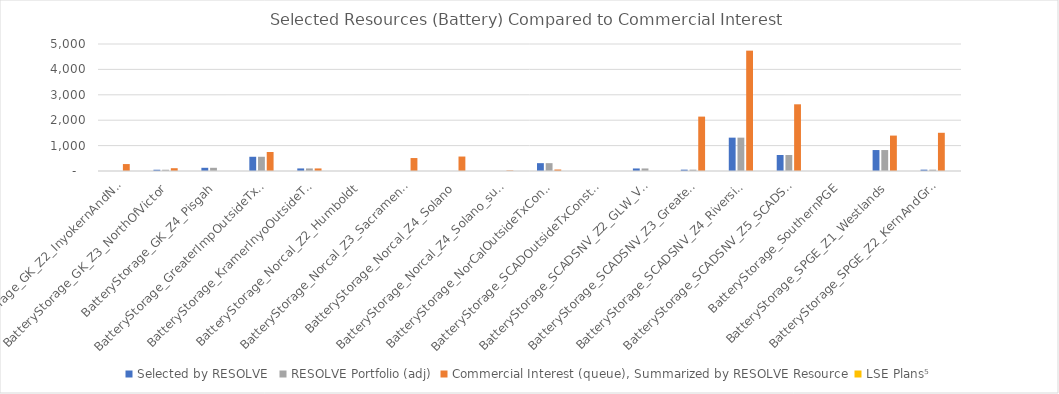
| Category | Selected by RESOLVE  | RESOLVE Portfolio (adj) |  Commercial Interest (queue), Summarized by RESOLVE Resource  | LSE Plans⁵ |
|---|---|---|---|---|
| BatteryStorage_GK_Z2_InyokernAndNorthOfKramer | 0 | 0 | 273.26 | 0 |
| BatteryStorage_GK_Z3_NorthOfVictor | 50 | 50 | 110.04 | 0 |
| BatteryStorage_GK_Z4_Pisgah | 126 | 126 | 0 | 0 |
| BatteryStorage_GreaterImpOutsideTxConstraintZones | 560 | 560 | 747.7 | 0 |
| BatteryStorage_KramerInyoOutsideTxConstraintZones | 101 | 101 | 100.98 | 0 |
| BatteryStorage_Norcal_Z2_Humboldt | 0 | 0 | 0 | 0 |
| BatteryStorage_Norcal_Z3_SacramentoRiver | 0 | 0 | 510 | 0 |
| BatteryStorage_Norcal_Z4_Solano | 0 | 0 | 569.5 | 0 |
| BatteryStorage_Norcal_Z4_Solano_subzone | 0 | 0 | 20 | 0 |
| BatteryStorage_NorCalOutsideTxConstraintZones | 309 | 309 | 58.75 | 0 |
| BatteryStorage_SCADOutsideTxConstraintZones | 0 | 0 | 0 | 0 |
| BatteryStorage_SCADSNV_Z2_GLW_VEA | 100 | 100 | 0 | 0 |
| BatteryStorage_SCADSNV_Z3_GreaterImperial | 53 | 53 | 2141.53 | 0 |
| BatteryStorage_SCADSNV_Z4_RiversideAndPalmSprings | 1313 | 1313 | 4738.333 | 0 |
| BatteryStorage_SCADSNV_Z5_SCADSNV | 629 | 629 | 2626.04 | 0 |
| BatteryStorage_SouthernPGE | 0 | 0 | 0 | 0 |
| BatteryStorage_SPGE_Z1_Westlands | 825 | 825 | 1394.24 | 0 |
| BatteryStorage_SPGE_Z2_KernAndGreaterCarrizo | 53 | 53 | 1504.67 | 0 |